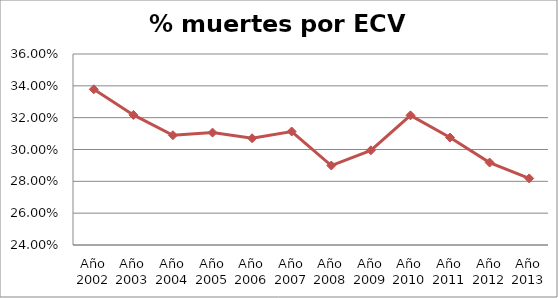
| Category | Series 0 |
|---|---|
| Año 2002 | 0.338 |
| Año 2003 | 0.322 |
| Año 2004 | 0.309 |
| Año 2005 | 0.311 |
| Año 2006 | 0.307 |
| Año 2007 | 0.311 |
| Año 2008 | 0.29 |
| Año 2009 | 0.299 |
| Año 2010 | 0.321 |
| Año 2011 | 0.308 |
| Año 2012 | 0.292 |
| Año 2013 | 0.282 |